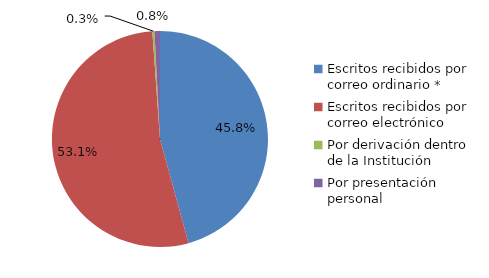
| Category | Series 0 |
|---|---|
| Escritos recibidos por correo ordinario * | 445 |
| Escritos recibidos por correo electrónico | 517 |
| Por derivación dentro de la Institución | 3 |
| Por presentación personal | 8 |